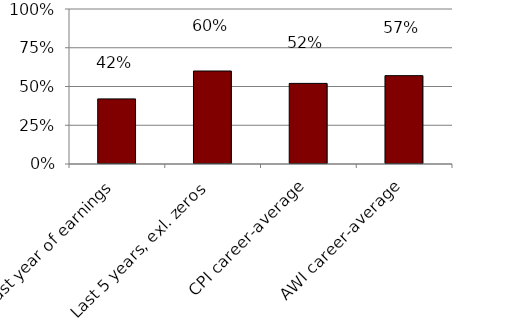
| Category | At Risk |
|---|---|
| Last year of earnings | 0.42 |
| Last 5 years, exl. zeros | 0.6 |
| CPI career-average | 0.52 |
| AWI career-average | 0.57 |